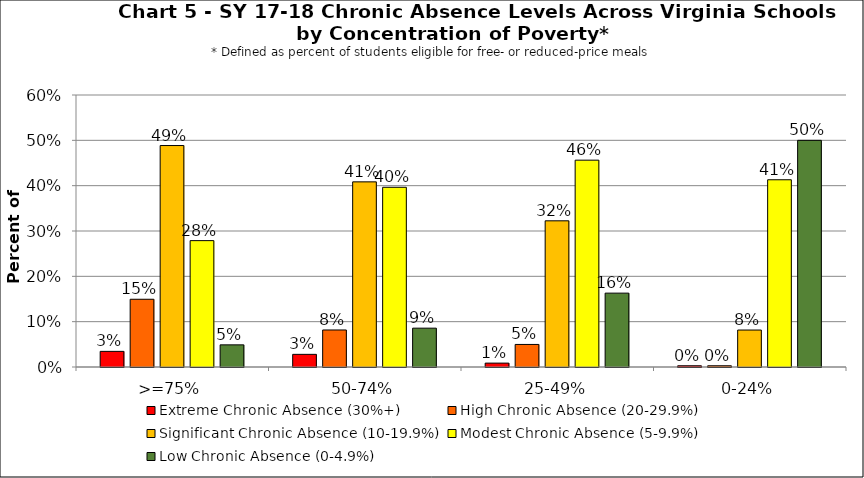
| Category | Extreme Chronic Absence (30%+) | High Chronic Absence (20-29.9%) | Significant Chronic Absence (10-19.9%) | Modest Chronic Absence (5-9.9%) | Low Chronic Absence (0-4.9%) |
|---|---|---|---|---|---|
| 0 | 0.034 | 0.149 | 0.489 | 0.279 | 0.049 |
| 1 | 0.028 | 0.082 | 0.408 | 0.396 | 0.086 |
| 2 | 0.009 | 0.05 | 0.322 | 0.456 | 0.163 |
| 3 | 0.003 | 0.003 | 0.082 | 0.413 | 0.5 |